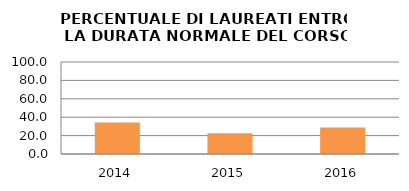
| Category | 2014 2015 2016 |
|---|---|
| 2014.0 | 34.211 |
| 2015.0 | 22.642 |
| 2016.0 | 28.889 |